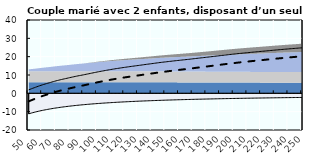
| Category | Coin fiscal moyen (somme des composantes) | Taux moyen d'imposition net en % du salaire brut |
|---|---|---|
| 50.0 | 1.899 | -4.38 |
| 51.0 | 2.193 | -4.067 |
| 52.0 | 2.488 | -3.753 |
| 53.0 | 2.771 | -3.451 |
| 54.0 | 3.033 | -3.173 |
| 55.0 | 3.311 | -2.877 |
| 56.0 | 3.583 | -2.588 |
| 57.0 | 3.859 | -2.294 |
| 58.0 | 4.126 | -2.01 |
| 59.0 | 4.37 | -1.75 |
| 60.0 | 4.62 | -1.485 |
| 61.0 | 4.861 | -1.228 |
| 62.0 | 5.082 | -0.993 |
| 63.0 | 5.308 | -0.752 |
| 64.0 | 5.527 | -0.519 |
| 65.0 | 5.727 | -0.306 |
| 66.0 | 5.949 | -0.07 |
| 67.0 | 6.176 | 0.171 |
| 68.0 | 6.382 | 0.39 |
| 69.0 | 6.596 | 0.618 |
| 70.0 | 6.804 | 0.84 |
| 71.0 | 6.992 | 1.04 |
| 72.0 | 7.175 | 1.234 |
| 73.0 | 7.367 | 1.438 |
| 74.0 | 7.539 | 1.622 |
| 75.0 | 7.721 | 1.815 |
| 76.0 | 7.885 | 1.989 |
| 77.0 | 8.044 | 2.159 |
| 78.0 | 8.212 | 2.338 |
| 79.0 | 8.384 | 2.521 |
| 80.0 | 8.551 | 2.699 |
| 81.0 | 8.73 | 2.889 |
| 82.0 | 8.889 | 3.058 |
| 83.0 | 9.044 | 3.223 |
| 84.0 | 9.21 | 3.4 |
| 85.0 | 9.358 | 3.557 |
| 86.0 | 9.517 | 3.726 |
| 87.0 | 9.658 | 3.876 |
| 88.0 | 9.795 | 4.022 |
| 89.0 | 9.944 | 4.18 |
| 90.0 | 10.078 | 4.323 |
| 91.0 | 10.232 | 4.486 |
| 92.0 | 10.398 | 4.663 |
| 93.0 | 10.544 | 4.819 |
| 94.0 | 10.687 | 4.971 |
| 95.0 | 10.85 | 5.144 |
| 96.0 | 11.004 | 5.308 |
| 97.0 | 11.155 | 5.469 |
| 98.0 | 11.32 | 5.644 |
| 99.0 | 11.465 | 5.798 |
| 100.0 | 11.623 | 5.967 |
| 101.0 | 11.762 | 6.115 |
| 102.0 | 11.898 | 6.26 |
| 103.0 | 12.048 | 6.419 |
| 104.0 | 12.179 | 6.558 |
| 105.0 | 12.307 | 6.695 |
| 106.0 | 12.456 | 6.853 |
| 107.0 | 12.586 | 6.991 |
| 108.0 | 12.714 | 7.127 |
| 109.0 | 12.856 | 7.278 |
| 110.0 | 12.979 | 7.409 |
| 111.0 | 13.115 | 7.555 |
| 112.0 | 13.234 | 7.681 |
| 113.0 | 13.35 | 7.805 |
| 114.0 | 13.48 | 7.943 |
| 115.0 | 13.593 | 8.063 |
| 116.0 | 13.703 | 8.18 |
| 117.0 | 13.827 | 8.312 |
| 118.0 | 13.933 | 8.425 |
| 119.0 | 14.038 | 8.536 |
| 120.0 | 14.156 | 8.661 |
| 121.0 | 14.257 | 8.769 |
| 122.0 | 14.371 | 8.89 |
| 123.0 | 14.468 | 8.994 |
| 124.0 | 14.57 | 9.103 |
| 125.0 | 14.686 | 9.226 |
| 126.0 | 14.785 | 9.331 |
| 127.0 | 14.882 | 9.434 |
| 128.0 | 14.992 | 9.552 |
| 129.0 | 15.087 | 9.652 |
| 130.0 | 15.179 | 9.751 |
| 131.0 | 15.285 | 9.863 |
| 132.0 | 15.381 | 9.965 |
| 133.0 | 15.497 | 10.089 |
| 134.0 | 15.596 | 10.194 |
| 135.0 | 15.693 | 10.298 |
| 136.0 | 15.805 | 10.416 |
| 137.0 | 15.899 | 10.517 |
| 138.0 | 15.992 | 10.616 |
| 139.0 | 16.101 | 10.732 |
| 140.0 | 16.197 | 10.834 |
| 141.0 | 16.291 | 10.934 |
| 142.0 | 16.4 | 11.049 |
| 143.0 | 16.507 | 11.163 |
| 144.0 | 16.597 | 11.259 |
| 145.0 | 16.701 | 11.37 |
| 146.0 | 16.803 | 11.479 |
| 147.0 | 16.889 | 11.57 |
| 148.0 | 16.982 | 11.673 |
| 149.0 | 17.074 | 11.774 |
| 150.0 | 17.15 | 11.858 |
| 151.0 | 17.239 | 11.956 |
| 152.0 | 17.329 | 12.054 |
| 153.0 | 17.421 | 12.156 |
| 154.0 | 17.498 | 12.241 |
| 155.0 | 17.588 | 12.34 |
| 156.0 | 17.677 | 12.438 |
| 157.0 | 17.751 | 12.519 |
| 158.0 | 17.838 | 12.614 |
| 159.0 | 17.924 | 12.709 |
| 160.0 | 17.995 | 12.786 |
| 161.0 | 18.078 | 12.879 |
| 162.0 | 18.161 | 12.969 |
| 163.0 | 18.245 | 13.061 |
| 164.0 | 18.316 | 13.14 |
| 165.0 | 18.401 | 13.233 |
| 166.0 | 18.485 | 13.325 |
| 167.0 | 18.554 | 13.4 |
| 168.0 | 18.644 | 13.498 |
| 169.0 | 18.735 | 13.598 |
| 170.0 | 18.826 | 13.697 |
| 171.0 | 18.901 | 13.779 |
| 172.0 | 18.993 | 13.88 |
| 173.0 | 19.086 | 13.98 |
| 174.0 | 19.162 | 14.064 |
| 175.0 | 19.253 | 14.163 |
| 176.0 | 19.342 | 14.26 |
| 177.0 | 19.416 | 14.341 |
| 178.0 | 19.504 | 14.437 |
| 179.0 | 19.596 | 14.536 |
| 180.0 | 19.686 | 14.635 |
| 181.0 | 19.76 | 14.716 |
| 182.0 | 19.849 | 14.812 |
| 183.0 | 19.94 | 14.911 |
| 184.0 | 20.016 | 14.993 |
| 185.0 | 20.108 | 15.094 |
| 186.0 | 20.202 | 15.196 |
| 187.0 | 20.297 | 15.298 |
| 188.0 | 20.377 | 15.385 |
| 189.0 | 20.472 | 15.489 |
| 190.0 | 20.566 | 15.591 |
| 191.0 | 20.644 | 15.675 |
| 192.0 | 20.736 | 15.775 |
| 193.0 | 20.828 | 15.874 |
| 194.0 | 20.903 | 15.956 |
| 195.0 | 20.992 | 16.053 |
| 196.0 | 21.081 | 16.149 |
| 197.0 | 21.169 | 16.244 |
| 198.0 | 21.241 | 16.322 |
| 199.0 | 21.327 | 16.415 |
| 200.0 | 21.412 | 16.508 |
| 201.0 | 21.482 | 16.583 |
| 202.0 | 21.565 | 16.674 |
| 203.0 | 21.648 | 16.764 |
| 204.0 | 21.73 | 16.853 |
| 205.0 | 21.797 | 16.925 |
| 206.0 | 21.878 | 17.012 |
| 207.0 | 21.957 | 17.099 |
| 208.0 | 22.022 | 17.169 |
| 209.0 | 22.1 | 17.253 |
| 210.0 | 22.178 | 17.337 |
| 211.0 | 22.24 | 17.405 |
| 212.0 | 22.317 | 17.488 |
| 213.0 | 22.392 | 17.57 |
| 214.0 | 22.467 | 17.651 |
| 215.0 | 22.527 | 17.716 |
| 216.0 | 22.6 | 17.795 |
| 217.0 | 22.673 | 17.874 |
| 218.0 | 22.731 | 17.937 |
| 219.0 | 22.803 | 18.015 |
| 220.0 | 22.874 | 18.092 |
| 221.0 | 22.948 | 18.172 |
| 222.0 | 23.011 | 18.24 |
| 223.0 | 23.089 | 18.324 |
| 224.0 | 23.165 | 18.406 |
| 225.0 | 23.227 | 18.473 |
| 226.0 | 23.302 | 18.554 |
| 227.0 | 23.377 | 18.635 |
| 228.0 | 23.436 | 18.7 |
| 229.0 | 23.51 | 18.779 |
| 230.0 | 23.582 | 18.857 |
| 231.0 | 23.655 | 18.935 |
| 232.0 | 23.712 | 18.998 |
| 233.0 | 23.783 | 19.074 |
| 234.0 | 23.853 | 19.15 |
| 235.0 | 23.909 | 19.211 |
| 236.0 | 23.979 | 19.285 |
| 237.0 | 24.047 | 19.36 |
| 238.0 | 24.115 | 19.433 |
| 239.0 | 24.169 | 19.491 |
| 240.0 | 24.236 | 19.564 |
| 241.0 | 24.303 | 19.635 |
| 242.0 | 24.355 | 19.692 |
| 243.0 | 24.421 | 19.763 |
| 244.0 | 24.486 | 19.833 |
| 245.0 | 24.537 | 19.888 |
| 246.0 | 24.601 | 19.957 |
| 247.0 | 24.664 | 20.026 |
| 248.0 | 24.727 | 20.093 |
| 249.0 | 24.776 | 20.147 |
| 250.0 | 24.838 | 20.214 |